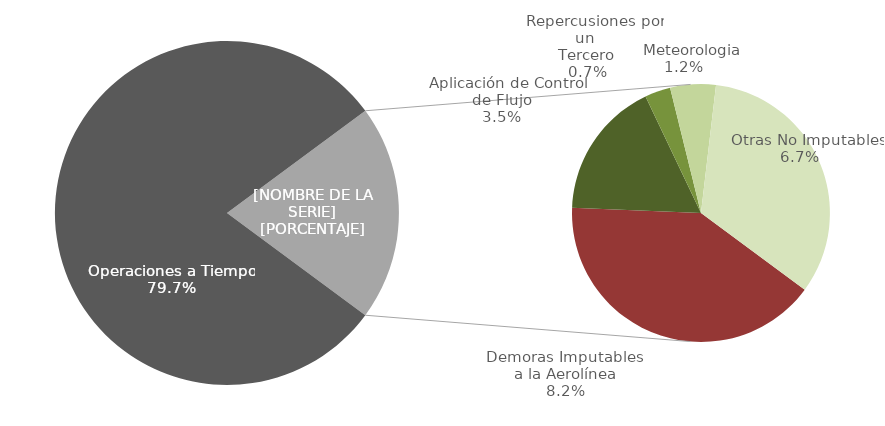
| Category | Demoras |
|---|---|
| Operaciones a Tiempo | 20398 |
| Demoras Imputables 
a la Aerolínea | 2099 |
|    Aplicación de Control 
de Flujo | 896 |
|    Repercusiones por un 
Tercero | 167 |
|    Meteorologia | 296 |
|    Otras No Imputables | 1724 |